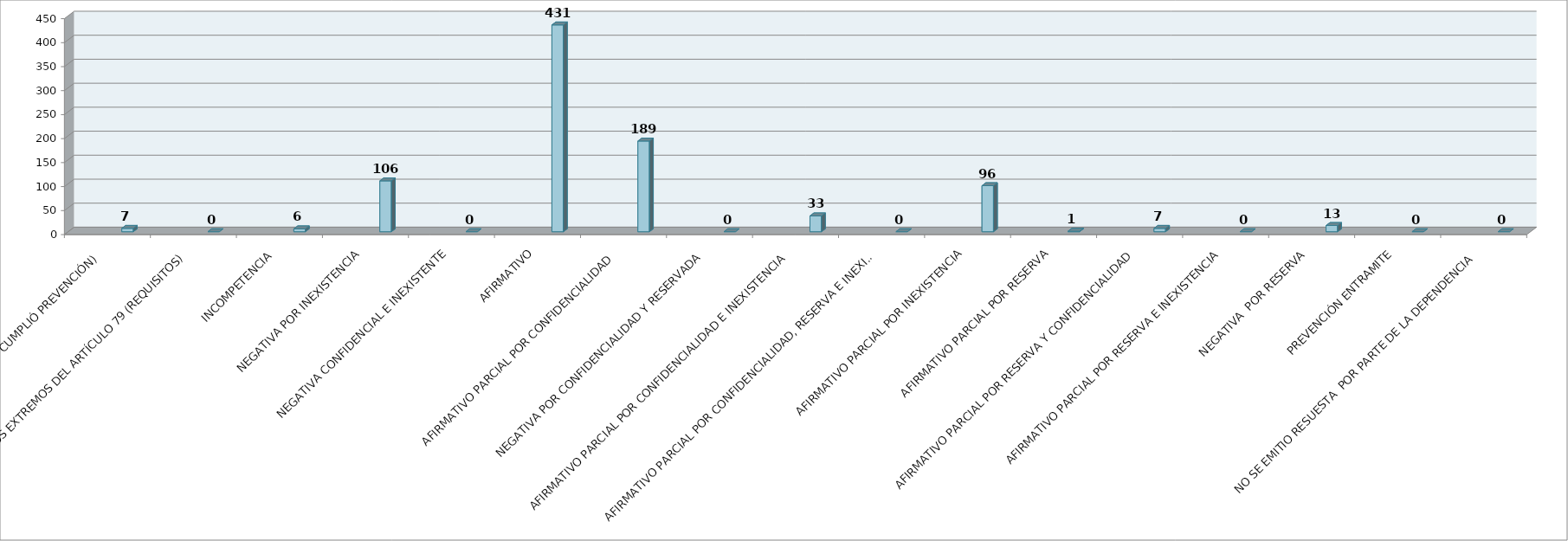
| Category | Series 0 | Series 1 | Series 2 | Series 3 | Series 4 | Series 5 |
|---|---|---|---|---|---|---|
| SE TIENE POR NO PRESENTADA ( NO CUMPLIÓ PREVENCIÓN) |  |  |  |  | 7 |  |
| NO CUMPLIO CON LOS EXTREMOS DEL ARTÍCULO 79 (REQUISITOS) |  |  |  |  | 0 |  |
| INCOMPETENCIA  |  |  |  |  | 6 |  |
| NEGATIVA POR INEXISTENCIA |  |  |  |  | 106 |  |
| NEGATIVA CONFIDENCIAL E INEXISTENTE |  |  |  |  | 0 |  |
| AFIRMATIVO |  |  |  |  | 431 |  |
| AFIRMATIVO PARCIAL POR CONFIDENCIALIDAD  |  |  |  |  | 189 |  |
| NEGATIVA POR CONFIDENCIALIDAD Y RESERVADA |  |  |  |  | 0 |  |
| AFIRMATIVO PARCIAL POR CONFIDENCIALIDAD E INEXISTENCIA |  |  |  |  | 33 |  |
| AFIRMATIVO PARCIAL POR CONFIDENCIALIDAD, RESERVA E INEXISTENCIA |  |  |  |  | 0 |  |
| AFIRMATIVO PARCIAL POR INEXISTENCIA |  |  |  |  | 96 |  |
| AFIRMATIVO PARCIAL POR RESERVA |  |  |  |  | 1 |  |
| AFIRMATIVO PARCIAL POR RESERVA Y CONFIDENCIALIDAD |  |  |  |  | 7 |  |
| AFIRMATIVO PARCIAL POR RESERVA E INEXISTENCIA |  |  |  |  | 0 |  |
| NEGATIVA  POR RESERVA |  |  |  |  | 13 |  |
| PREVENCIÓN ENTRAMITE |  |  |  |  | 0 |  |
| NO SE EMITIO RESUESTA  POR PARTE DE LA DEPENDENCIA |  |  |  |  | 0 |  |